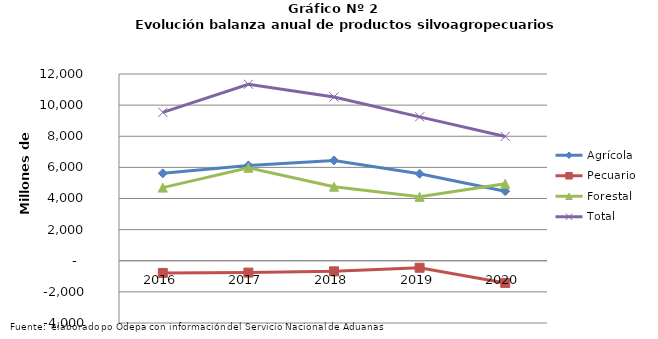
| Category | Agrícola | Pecuario | Forestal | Total |
|---|---|---|---|---|
| 2016.0 | 5619304 | -782654 | 4700192 | 9536842 |
| 2017.0 | 6126434 | -761998 | 5976134 | 11340570 |
| 2018.0 | 6446329 | -681646 | 4755333 | 10520016 |
| 2019.0 | 5590631 | -450130 | 4105622 | 9246123 |
| 2020.0 | 4470044 | -1425114 | 4942806 | 7987736 |